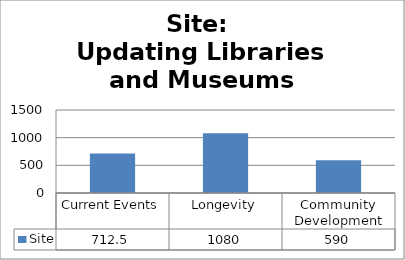
| Category | Site |
|---|---|
| Current Events | 712.5 |
| Longevity | 1080 |
| Community Development | 590 |